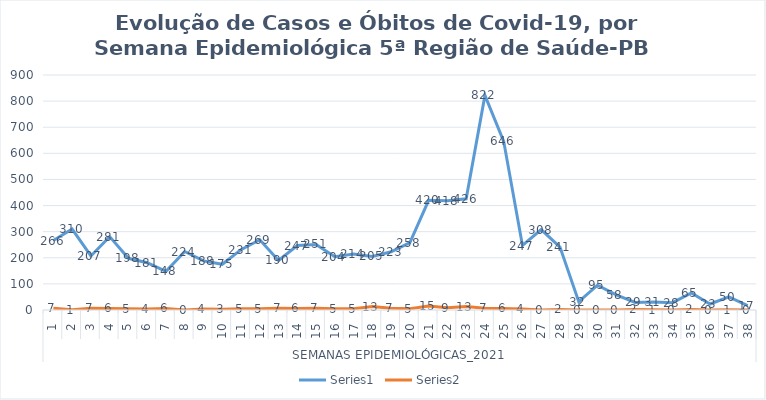
| Category | Series 0 | Series 1 |
|---|---|---|
| 0 | 266 | 7 |
| 1 | 310 | 1 |
| 2 | 207 | 7 |
| 3 | 281 | 6 |
| 4 | 198 | 5 |
| 5 | 181 | 4 |
| 6 | 148 | 6 |
| 7 | 224 | 0 |
| 8 | 188 | 4 |
| 9 | 175 | 3 |
| 10 | 231 | 5 |
| 11 | 269 | 5 |
| 12 | 190 | 7 |
| 13 | 247 | 6 |
| 14 | 251 | 7 |
| 15 | 204 | 5 |
| 16 | 214 | 5 |
| 17 | 205 | 13 |
| 18 | 223 | 7 |
| 19 | 258 | 5 |
| 20 | 420 | 15 |
| 21 | 418 | 9 |
| 22 | 426 | 13 |
| 23 | 822 | 7 |
| 24 | 646 | 6 |
| 25 | 247 | 4 |
| 26 | 308 | 0 |
| 27 | 241 | 2 |
| 28 | 32 | 0 |
| 29 | 95 | 0 |
| 30 | 58 | 0 |
| 31 | 29 | 2 |
| 32 | 31 | 1 |
| 33 | 28 | 0 |
| 34 | 65 | 2 |
| 35 | 23 | 0 |
| 36 | 50 | 1 |
| 37 | 17 | 0 |